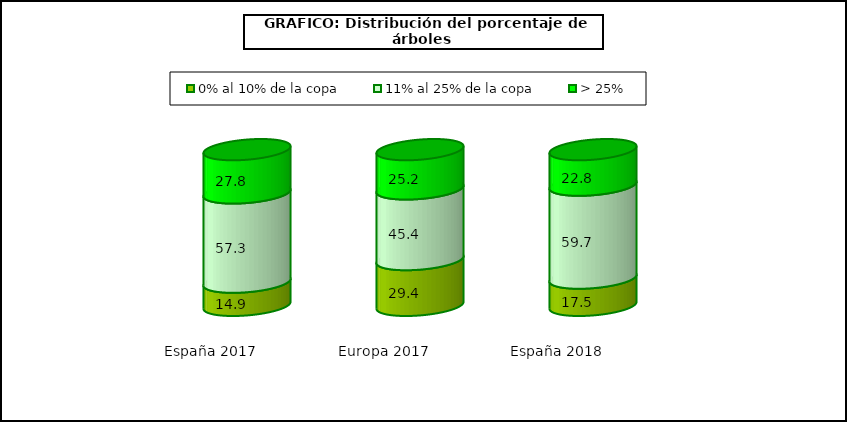
| Category | 0% al 10% de la copa | 11% al 25% de la copa | > 25% |
|---|---|---|---|
| España 2017 | 14.9 | 57.3 | 27.8 |
| Europa 2017 | 29.4 | 45.4 | 25.2 |
| España 2018 | 17.5 | 59.7 | 22.8 |